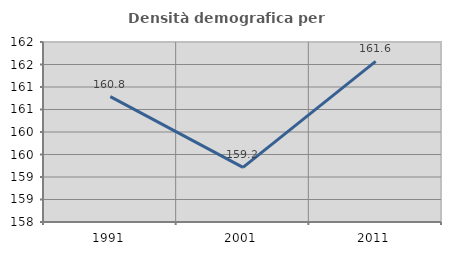
| Category | Densità demografica |
|---|---|
| 1991.0 | 160.785 |
| 2001.0 | 159.215 |
| 2011.0 | 161.57 |